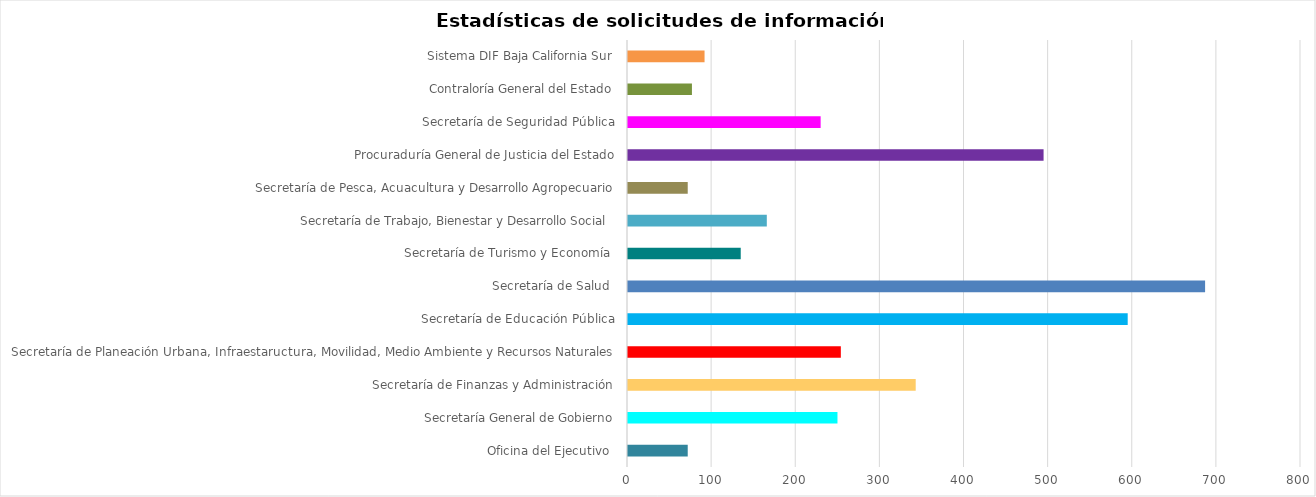
| Category | Series 0 |
|---|---|
| Oficina del Ejecutivo  | 71 |
| Secretaría General de Gobierno | 249 |
| Secretaría de Finanzas y Administración | 342 |
| Secretaría de Planeación Urbana, Infraestaructura, Movilidad, Medio Ambiente y Recursos Naturales | 253 |
| Secretaría de Educación Pública | 594 |
| Secretaría de Salud  | 686 |
| Secretaría de Turismo y Economía  | 134 |
| Secretaría de Trabajo, Bienestar y Desarrollo Social  | 165 |
| Secretaría de Pesca, Acuacultura y Desarrollo Agropecuario | 71 |
| Procuraduría General de Justicia del Estado | 494 |
| Secretaría de Seguridad Pública | 229 |
| Contraloría General del Estado | 76 |
| Sistema DIF Baja California Sur | 91 |